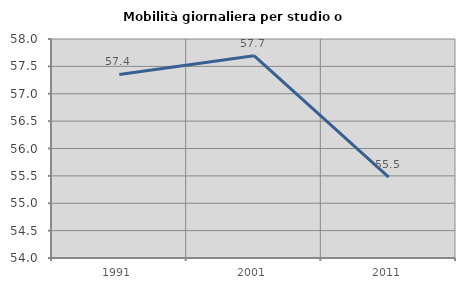
| Category | Mobilità giornaliera per studio o lavoro |
|---|---|
| 1991.0 | 57.352 |
| 2001.0 | 57.695 |
| 2011.0 | 55.477 |